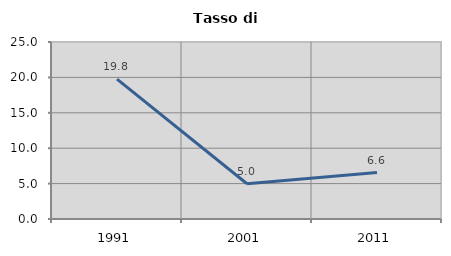
| Category | Tasso di disoccupazione   |
|---|---|
| 1991.0 | 19.757 |
| 2001.0 | 4.984 |
| 2011.0 | 6.567 |